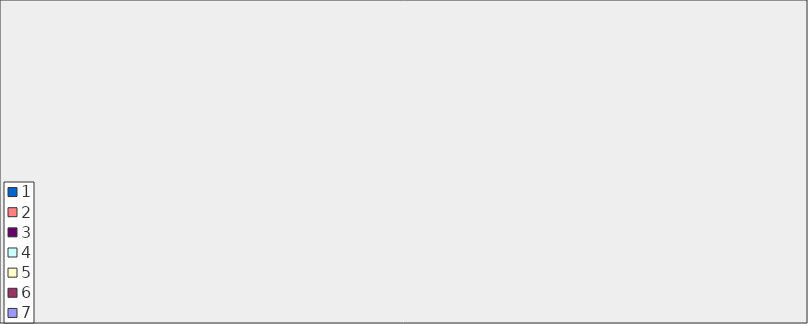
| Category | 7 | 6 | 5 | 4 | 3 | 2 | 1 |
|---|---|---|---|---|---|---|---|
| We buy food which is grown locally. | 16 | 25 | 29 | 32 | 12 | 3 | 7 |
| We buy food labelled fair trade or organic. | 6 | 10 | 24 | 24 | 21 | 20 | 18 |
| We buy food regardless of visual qualities | 4 | 7 | 6 | 8 | 12 | 17 | 70 |
| We buy food that does not contain palm oil. | 7 | 6 | 3 | 18 | 18 | 19 | 48 |
| We prefer buying fruit and vegetables which are in season | 50 | 43 | 18 | 8 | 5 | 0 | 1 |
| We take prices into account so that we pay as little as possible. | 14 | 14 | 32 | 24 | 11 | 14 | 13 |
| We buy food according to what we feel like eating at the moment. | 27 | 22 | 24 | 30 | 9 | 7 | 7 |